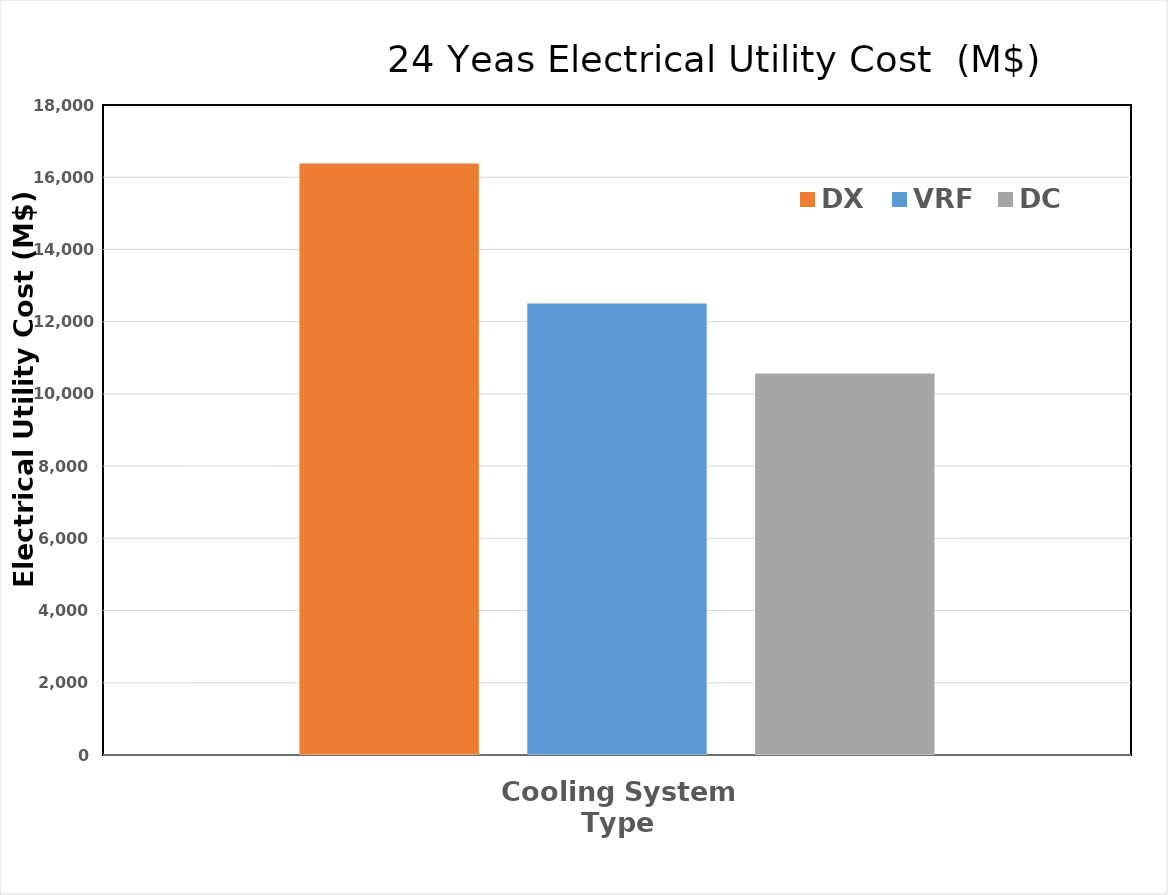
| Category | DX | VRF | DC |
|---|---|---|---|
| 0 | 16381.712 | 12504.761 | 10562.056 |